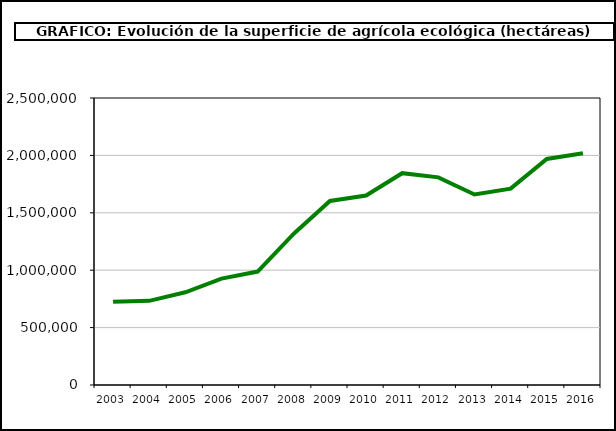
| Category | Superficie (ha) |
|---|---|
| 2003.0 | 725254 |
| 2004.0 | 733182 |
| 2005.0 | 807569 |
| 2006.0 | 926390 |
| 2007.0 | 988323 |
| 2008.0 | 1317752 |
| 2009.0 | 1602868 |
| 2010.0 | 1650866 |
| 2011.0 | 1845039 |
| 2012.0 | 1808492 |
| 2013.0 | 1659916 |
| 2014.0 | 1710493 |
| 2015.0 | 1968570 |
| 2016.0 | 2018802 |